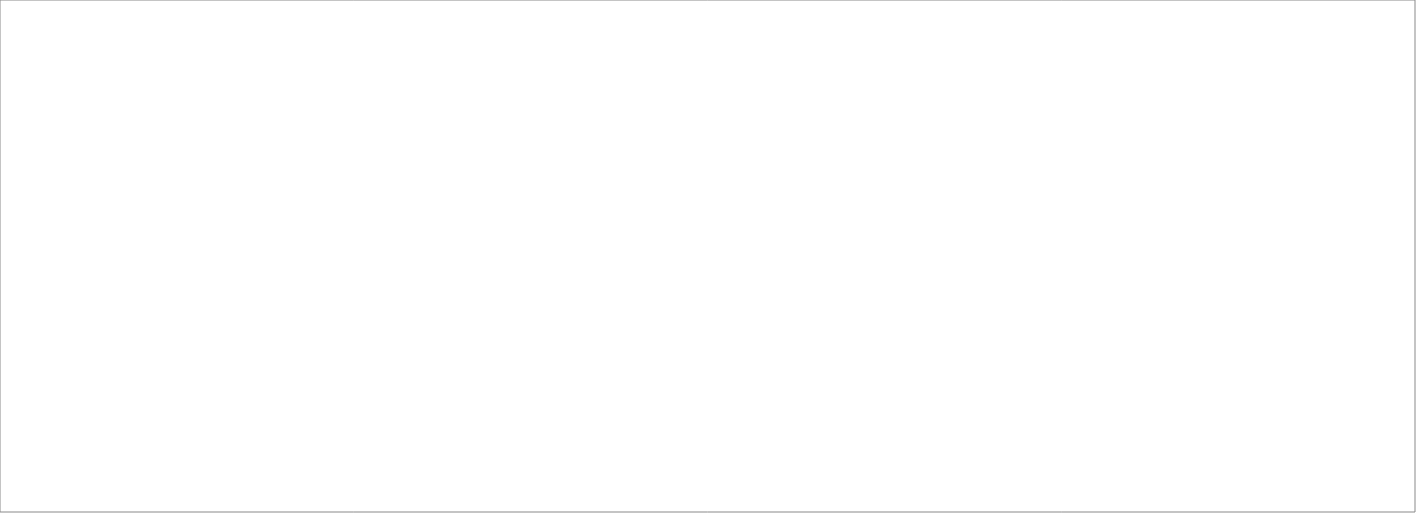
| Category | Total |
|---|---|
| Assessio Sverige AB | 100 |
| Randstad AB | 70.6 |
| Michael Catenacci AB | 70 |
| OnePartner Group AB | 70 |
| Pro Astri AB | 70 |